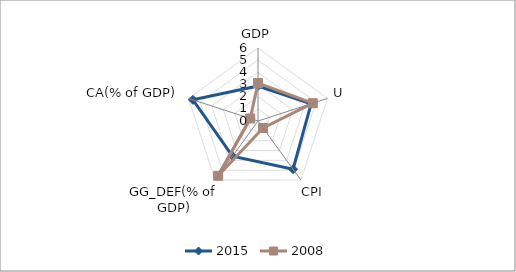
| Category | 2015 | 2008 |
|---|---|---|
| GDP | 2.88 | 3.12 |
| U | 4.592 | 4.737 |
| CPI | 4.9 | 0.714 |
| GG_DEF(% of GDP) | 3.571 | 5.572 |
| CA(% of GDP) | 5.625 | 0.67 |